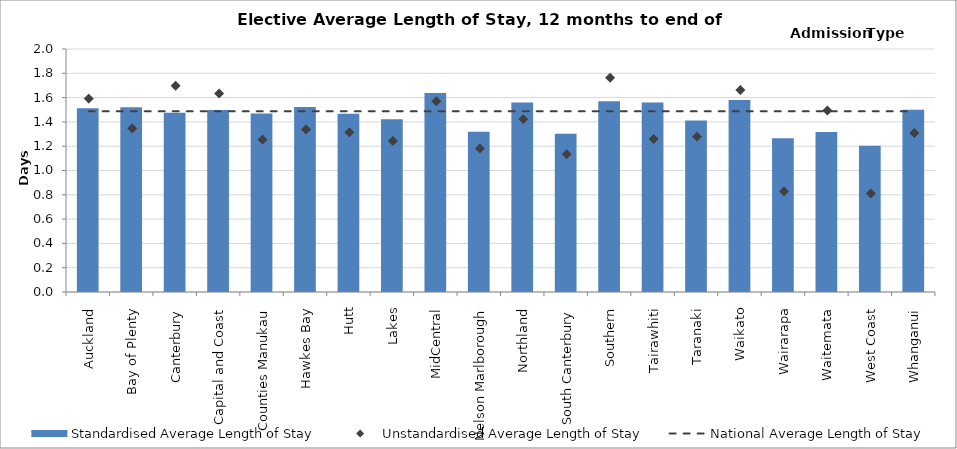
| Category | Standardised Average Length of Stay |
|---|---|
| Auckland | 1.513 |
| Bay of Plenty | 1.521 |
| Canterbury | 1.475 |
| Capital and Coast | 1.498 |
| Counties Manukau | 1.469 |
| Hawkes Bay | 1.522 |
| Hutt | 1.467 |
| Lakes | 1.423 |
| MidCentral | 1.639 |
| Nelson Marlborough | 1.318 |
| Northland | 1.56 |
| South Canterbury | 1.303 |
| Southern | 1.57 |
| Tairawhiti | 1.559 |
| Taranaki | 1.412 |
| Waikato | 1.581 |
| Wairarapa | 1.265 |
| Waitemata | 1.317 |
| West Coast | 1.204 |
| Whanganui | 1.501 |